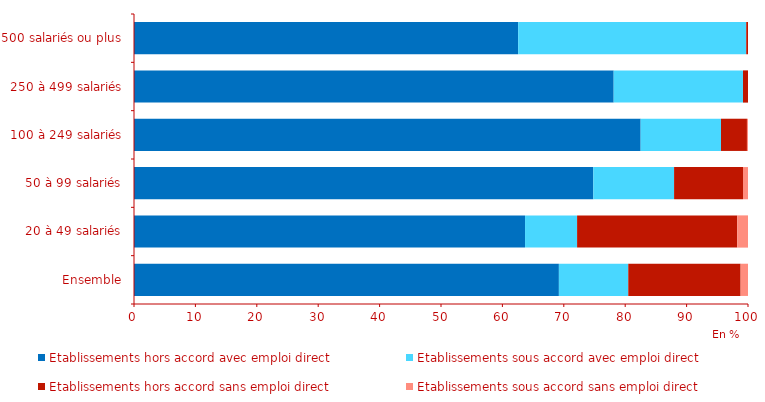
| Category | Etablissements hors accord avec emploi direct | Etablissements sous accord avec emploi direct | Etablissements hors accord sans emploi direct | Etablissements sous accord sans emploi direct |
|---|---|---|---|---|
| Ensemble | 69.2 | 11.3 | 18.3 | 1.2 |
| 20 à 49 salariés | 63.688 | 8.478 | 26.075 | 1.759 |
| 50 à 99 salariés | 74.808 | 13.154 | 11.228 | 0.81 |
| 100 à 249 salariés | 82.52 | 13.081 | 4.228 | 0.171 |
| 250 à 499 salariés | 78.125 | 21.056 | 0.819 | 0 |
| 500 salariés ou plus | 62.57 | 37.141 | 0.288 | 0 |